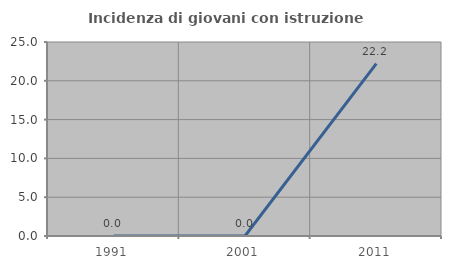
| Category | Incidenza di giovani con istruzione universitaria |
|---|---|
| 1991.0 | 0 |
| 2001.0 | 0 |
| 2011.0 | 22.222 |